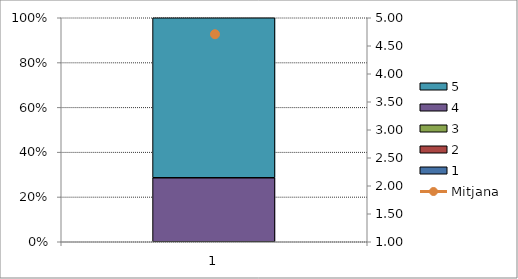
| Category | 1 | 2 | 3 | 4 | 5 |
|---|---|---|---|---|---|
| 0 | 0 | 0 | 0 | 4 | 10 |